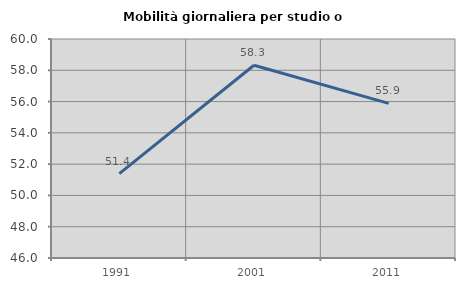
| Category | Mobilità giornaliera per studio o lavoro |
|---|---|
| 1991.0 | 51.393 |
| 2001.0 | 58.32 |
| 2011.0 | 55.884 |